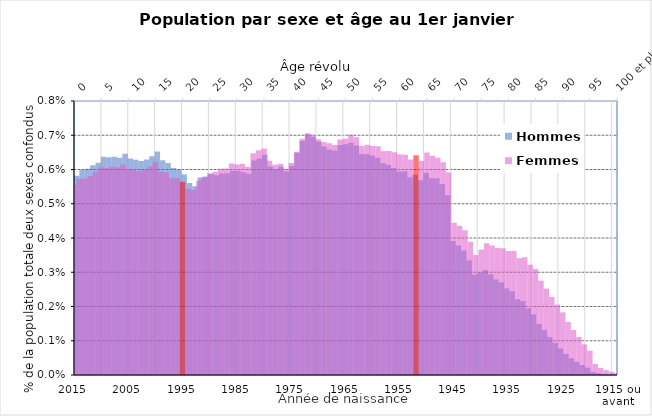
| Category | Hommes |
|---|---|
| 0 | 0.006 |
| 1 | 0.006 |
| 2 | 0.006 |
| 3 | 0.006 |
| 4 | 0.006 |
| 5 | 0.006 |
| 6 | 0.006 |
| 7 | 0.006 |
| 8 | 0.006 |
| 9 | 0.006 |
| 10 | 0.006 |
| 11 | 0.006 |
| 12 | 0.006 |
| 13 | 0.006 |
| 14 | 0.006 |
| 15 | 0.007 |
| 16 | 0.006 |
| 17 | 0.006 |
| 18 | 0.006 |
| 19 | 0.006 |
| 20 | 0.006 |
| 21 | 0.006 |
| 22 | 0.006 |
| 23 | 0.006 |
| 24 | 0.006 |
| 25 | 0.006 |
| 26 | 0.006 |
| 27 | 0.006 |
| 28 | 0.006 |
| 29 | 0.006 |
| 30 | 0.006 |
| 31 | 0.006 |
| 32 | 0.006 |
| 33 | 0.006 |
| 34 | 0.006 |
| 35 | 0.006 |
| 36 | 0.006 |
| 37 | 0.006 |
| 38 | 0.006 |
| 39 | 0.006 |
| 40 | 0.006 |
| 41 | 0.006 |
| 42 | 0.007 |
| 43 | 0.007 |
| 44 | 0.007 |
| 45 | 0.007 |
| 46 | 0.007 |
| 47 | 0.007 |
| 48 | 0.007 |
| 49 | 0.007 |
| 50 | 0.007 |
| 51 | 0.007 |
| 52 | 0.007 |
| 53 | 0.006 |
| 54 | 0.006 |
| 55 | 0.006 |
| 56 | 0.006 |
| 57 | 0.006 |
| 58 | 0.006 |
| 59 | 0.006 |
| 60 | 0.006 |
| 61 | 0.006 |
| 62 | 0.006 |
| 63 | 0.006 |
| 64 | 0.006 |
| 65 | 0.006 |
| 66 | 0.006 |
| 67 | 0.006 |
| 68 | 0.006 |
| 69 | 0.005 |
| 70 | 0.004 |
| 71 | 0.004 |
| 72 | 0.004 |
| 73 | 0.003 |
| 74 | 0.003 |
| 75 | 0.003 |
| 76 | 0.003 |
| 77 | 0.003 |
| 78 | 0.003 |
| 79 | 0.003 |
| 80 | 0.003 |
| 81 | 0.002 |
| 82 | 0.002 |
| 83 | 0.002 |
| 84 | 0.002 |
| 85 | 0.002 |
| 86 | 0.001 |
| 87 | 0.001 |
| 88 | 0.001 |
| 89 | 0.001 |
| 90 | 0.001 |
| 91 | 0.001 |
| 92 | 0 |
| 93 | 0 |
| 94 | 0 |
| 95 | 0 |
| 96 | 0 |
| 97 | 0 |
| 98 | 0 |
| 99 | 0 |
| 100 et plus | 0 |